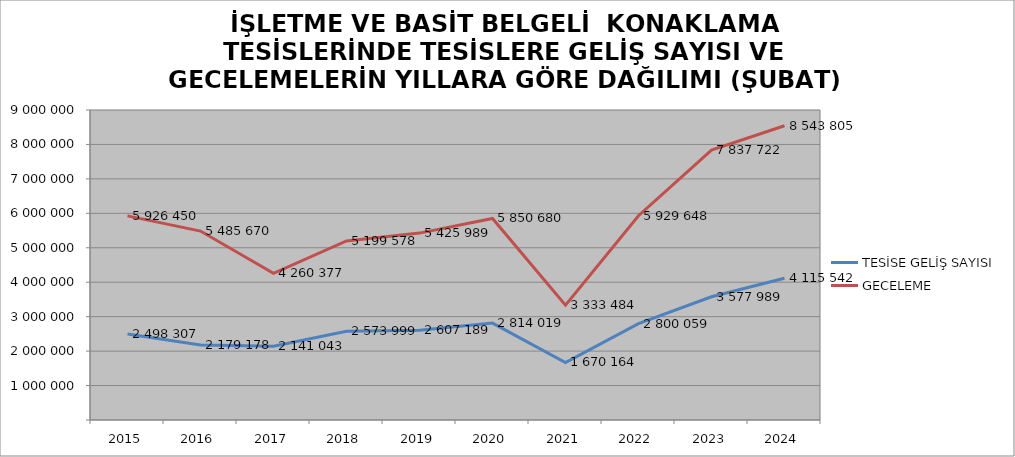
| Category | TESİSE GELİŞ SAYISI | GECELEME |
|---|---|---|
| 2015 | 2498307 | 5926450 |
| 2016 | 2179178 | 5485670 |
| 2017 | 2141043 | 4260377 |
| 2018 | 2573999 | 5199578 |
| 2019 | 2607189 | 5425989 |
| 2020 | 2814019 | 5850680 |
| 2021 | 1670164 | 3333484 |
| 2022 | 2800059 | 5929648 |
| 2023 | 3577989 | 7837722 |
| 2024 | 4115542 | 8543805 |